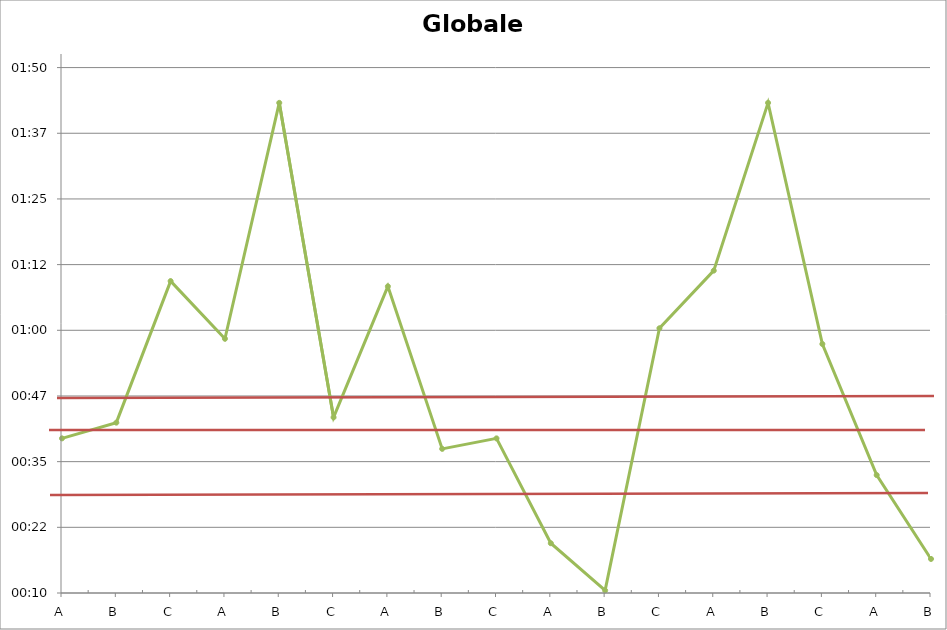
| Category | Globale Rumpfkraft |
|---|---|
| A | 0 |
| B | 0 |
| C | 0.001 |
| A | 0.001 |
| B | 0.001 |
| C | 0 |
| A | 0.001 |
| B | 0 |
| C | 0 |
| A | 0 |
| B | 0 |
| C | 0.001 |
| A | 0.001 |
| B | 0.001 |
| C | 0.001 |
| A | 0 |
| B | 0 |